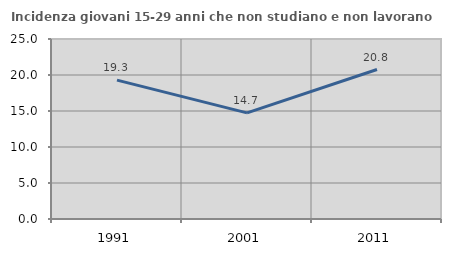
| Category | Incidenza giovani 15-29 anni che non studiano e non lavorano  |
|---|---|
| 1991.0 | 19.289 |
| 2001.0 | 14.742 |
| 2011.0 | 20.758 |